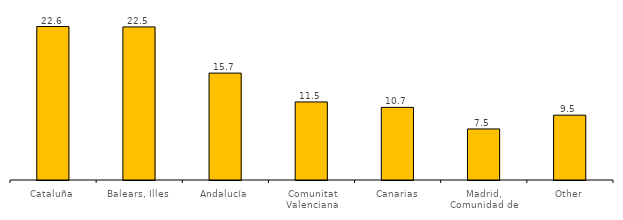
| Category | Series 0 |
|---|---|
| Cataluña | 22.569 |
| Balears, Illes | 22.51 |
| Andalucía | 15.72 |
| Comunitat Valenciana | 11.479 |
| Canarias | 10.68 |
| Madrid, Comunidad de | 7.507 |
| Other | 9.535 |